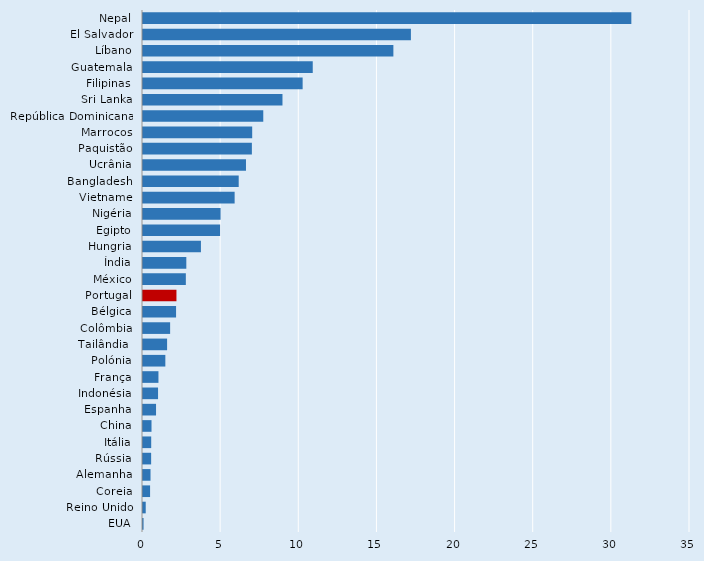
| Category | Series 0 |
|---|---|
| Nepal | 31.247 |
| El Salvador | 17.143 |
| Líbano | 16.02 |
| Guatemala | 10.861 |
| Filipinas | 10.215 |
| Sri Lanka | 8.924 |
| República Dominicana | 7.696 |
| Marrocos | 6.987 |
| Paquistão | 6.966 |
| Ucrânia | 6.589 |
| Bangladesh | 6.124 |
| Vietname | 5.863 |
| Nigéria | 4.965 |
| Egipto | 4.933 |
| Hungria | 3.707 |
| Índia | 2.772 |
| México | 2.741 |
| Portugal | 2.14 |
| Bélgica | 2.116 |
| Colômbia | 1.736 |
| Tailândia  | 1.542 |
| Polónia | 1.43 |
| França | 0.989 |
| Indonésia | 0.963 |
| Espanha | 0.834 |
| China | 0.545 |
| Itália | 0.525 |
| Rússia | 0.52 |
| Alemanha | 0.481 |
| Coreia | 0.453 |
| Reino Unido | 0.174 |
| EUA | 0.035 |